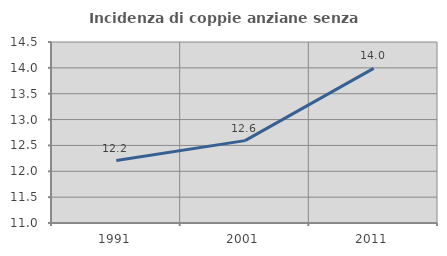
| Category | Incidenza di coppie anziane senza figli  |
|---|---|
| 1991.0 | 12.208 |
| 2001.0 | 12.593 |
| 2011.0 | 13.991 |